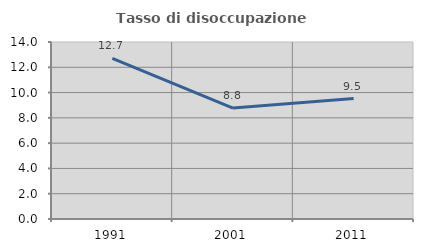
| Category | Tasso di disoccupazione giovanile  |
|---|---|
| 1991.0 | 12.698 |
| 2001.0 | 8.772 |
| 2011.0 | 9.524 |